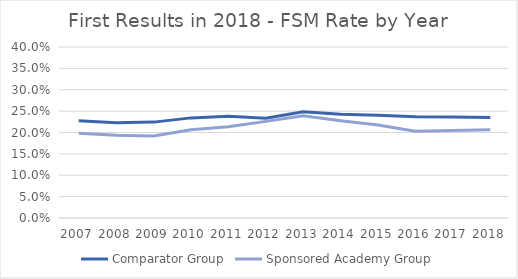
| Category | Comparator Group | Sponsored Academy Group |
|---|---|---|
| 2007.0 | 0.227 | 0.198 |
| 2008.0 | 0.223 | 0.193 |
| 2009.0 | 0.224 | 0.192 |
| 2010.0 | 0.234 | 0.207 |
| 2011.0 | 0.238 | 0.213 |
| 2012.0 | 0.234 | 0.226 |
| 2013.0 | 0.249 | 0.239 |
| 2014.0 | 0.243 | 0.228 |
| 2015.0 | 0.24 | 0.217 |
| 2016.0 | 0.237 | 0.203 |
| 2017.0 | 0.236 | 0.205 |
| 2018.0 | 0.235 | 0.206 |